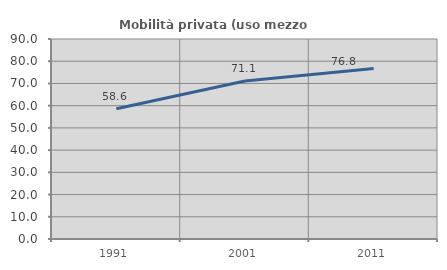
| Category | Mobilità privata (uso mezzo privato) |
|---|---|
| 1991.0 | 58.603 |
| 2001.0 | 71.101 |
| 2011.0 | 76.776 |